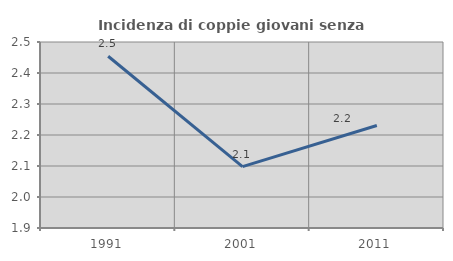
| Category | Incidenza di coppie giovani senza figli |
|---|---|
| 1991.0 | 2.454 |
| 2001.0 | 2.098 |
| 2011.0 | 2.23 |